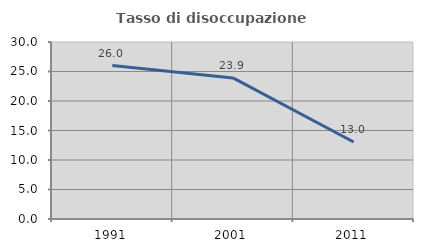
| Category | Tasso di disoccupazione giovanile  |
|---|---|
| 1991.0 | 26.012 |
| 2001.0 | 23.913 |
| 2011.0 | 13.043 |